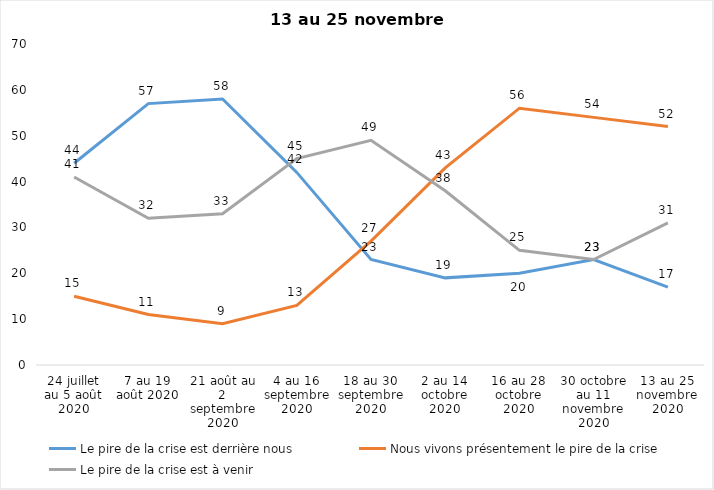
| Category | Le pire de la crise est derrière nous | Nous vivons présentement le pire de la crise | Le pire de la crise est à venir |
|---|---|---|---|
| 24 juillet au 5 août 2020 | 44 | 15 | 41 |
| 7 au 19 août 2020 | 57 | 11 | 32 |
| 21 août au 2 septembre 2020 | 58 | 9 | 33 |
| 4 au 16 septembre 2020 | 42 | 13 | 45 |
| 18 au 30 septembre 2020 | 23 | 27 | 49 |
| 2 au 14 octobre 2020 | 19 | 43 | 38 |
| 16 au 28 octobre 2020 | 20 | 56 | 25 |
| 30 octobre au 11 novembre 2020 | 23 | 54 | 23 |
| 13 au 25 novembre 2020 | 17 | 52 | 31 |